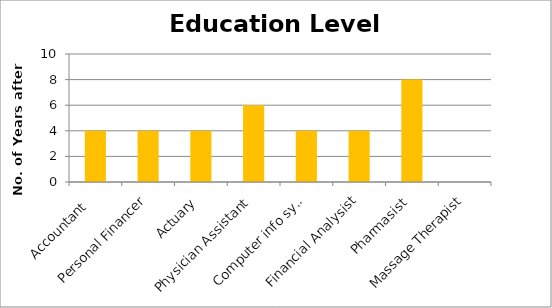
| Category | Series 0 |
|---|---|
| Accountant  | 4 |
| Personal Financer | 4 |
| Actuary | 4 |
| Physician Assistant | 6 |
| Computer info sys. | 4 |
| Financial Analysist | 4 |
| Pharmasist | 8 |
| Massage Therapist | 0 |